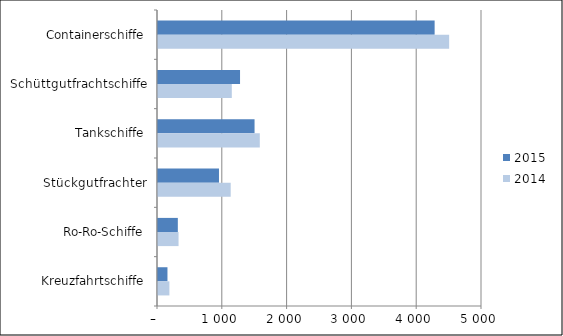
| Category | 2015 | 2014 |
|---|---|---|
| Containerschiffe | 4269 | 4493 |
| Schüttgutfrachtschiffe | 1266 | 1139 |
| Tankschiffe | 1490 | 1571 |
| Stückgutfrachter | 941 | 1122 |
| Ro-Ro-Schiffe | 306 | 317 |
| Kreuzfahrtschiffe | 146 | 176 |